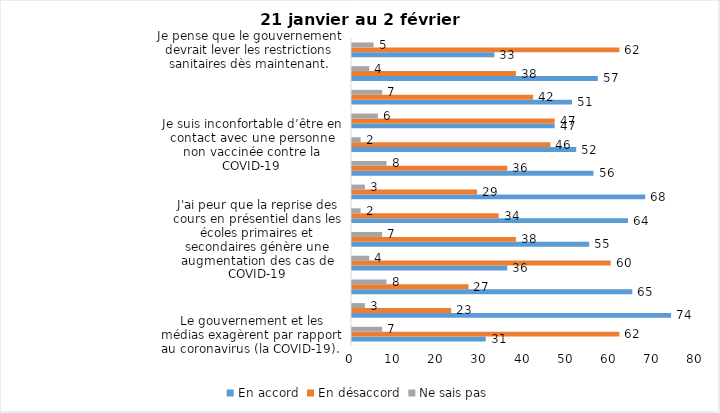
| Category | En accord | En désaccord | Ne sais pas |
|---|---|---|---|
| Le gouvernement et les médias exagèrent par rapport au coronavirus (la COVID-19). | 31 | 62 | 7 |
| J’ai peur que le système de santé soit débordé par les cas de COVID-19. | 74 | 23 | 3 |
| Je suis confiant que la vaccination protège efficacement contre les variants de la COVID-19 | 65 | 27 | 8 |
| Je suis favorable à ce que le port du masque ne soit plus obligatoire au Québec. | 36 | 60 | 4 |
| J'ai peur que la reprise des cours en présentiel dans les écoles primaires et secondaires génère une augmentation des cas de COVID-19 | 55 | 38 | 7 |
| Je crois que le passeport vaccinal devrait être requis pour davantage de services et commerces (ex. : spas, centre d’achats, centre de soins personnels. | 64 | 34 | 2 |
| Les personnes non adéquatement vaccinées contre la COVID-19 sont responsables des nouveaux cas et hospitalisations et contribuent à la prolongation de la pandémie au Québec. | 68 | 29 | 3 |
| La pandémie ne sera pas terminée au Québec avant que tous les habitants de la terre puissent être vaccinés contre la COVID-19.   | 56 | 36 | 8 |
| Je suis inconfortable d’être en contact avec une personne non vaccinée contre la COVID-19 | 52 | 46 | 2 |
| Je n'ai pas peur du variant Omicron, car il semble moins dangereux pour la santé. | 47 | 47 | 6 |
| La vaccination obligatoire contre la COVID-19 mettrait fin à la pandémie. | 51 | 42 | 7 |
| Je suis favorable à ce que les personnes non vaccinées paient une taxe supplémentaire (contribution santé). | 57 | 38 | 4 |
| Je pense que le gouvernement devrait lever les restrictions sanitaires dès maintenant. | 33 | 62 | 5 |